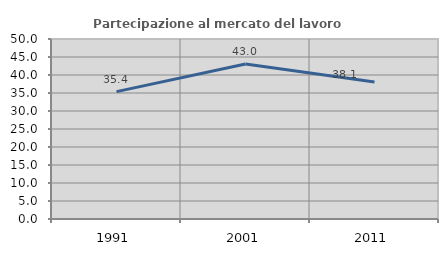
| Category | Partecipazione al mercato del lavoro  femminile |
|---|---|
| 1991.0 | 35.391 |
| 2001.0 | 43.043 |
| 2011.0 | 38.073 |